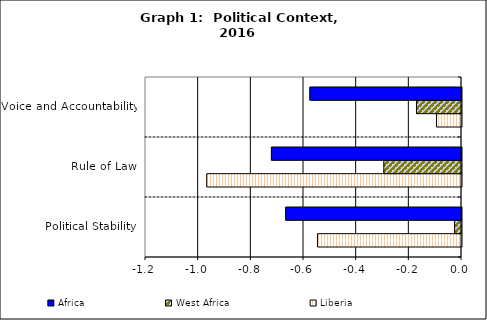
| Category | Liberia | West Africa | Africa |
|---|---|---|---|
| Political Stability | -0.547 | -0.026 | -0.667 |
| Rule of Law | -0.968 | -0.295 | -0.722 |
| Voice and Accountability | -0.095 | -0.171 | -0.576 |